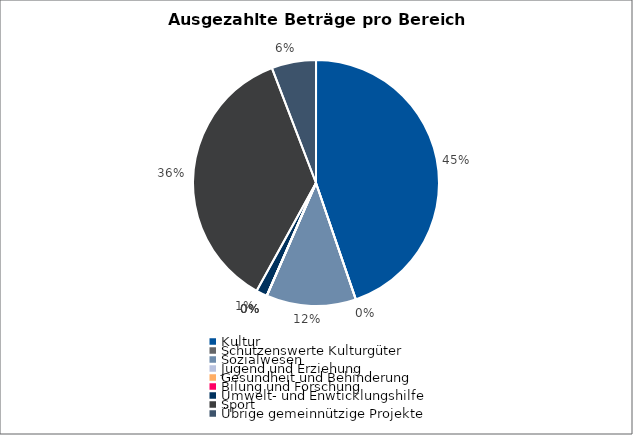
| Category | Series 0 |
|---|---|
| Kultur | 7703512 |
| Schützenswerte Kulturgüter | 0 |
| Sozialwesen | 2029620 |
| Jugend und Erziehung | 0 |
| Gesundheit und Behinderung | 0 |
| Bilung und Forschung | 0 |
| Umwelt- und Enwticklungshilfe | 250000 |
| Sport | 6224711 |
| Übrige gemeinnützige Projekte | 1005785 |